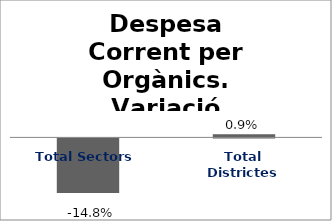
| Category | Series 0 |
|---|---|
| Total Sectors | -0.148 |
| Total Districtes | 0.009 |